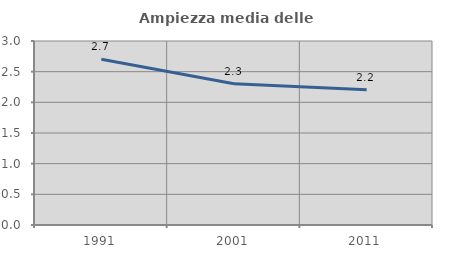
| Category | Ampiezza media delle famiglie |
|---|---|
| 1991.0 | 2.702 |
| 2001.0 | 2.303 |
| 2011.0 | 2.204 |